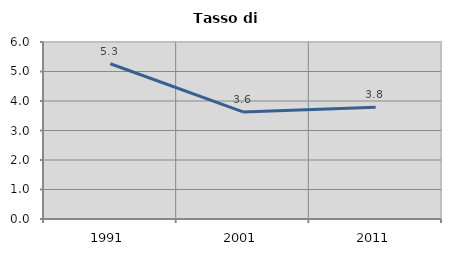
| Category | Tasso di disoccupazione   |
|---|---|
| 1991.0 | 5.263 |
| 2001.0 | 3.63 |
| 2011.0 | 3.785 |